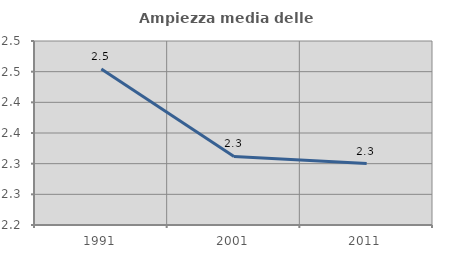
| Category | Ampiezza media delle famiglie |
|---|---|
| 1991.0 | 2.454 |
| 2001.0 | 2.312 |
| 2011.0 | 2.3 |